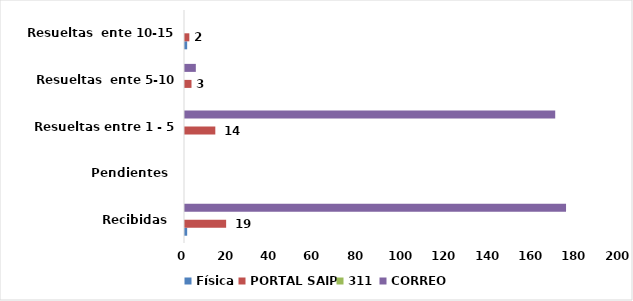
| Category | Física | PORTAL SAIP | 311 | CORREO |
|---|---|---|---|---|
| Recibidas  | 1 | 19 | 0 | 176 |
| Pendientes  | 0 | 0 | 0 | 0 |
| Resueltas entre 1 - 5 días | 0 | 14 | 0 | 171 |
| Resueltas  ente 5-10 dias | 0 | 3 | 0 | 5 |
| Resueltas  ente 10-15 dias | 1 | 2 | 0 | 0 |